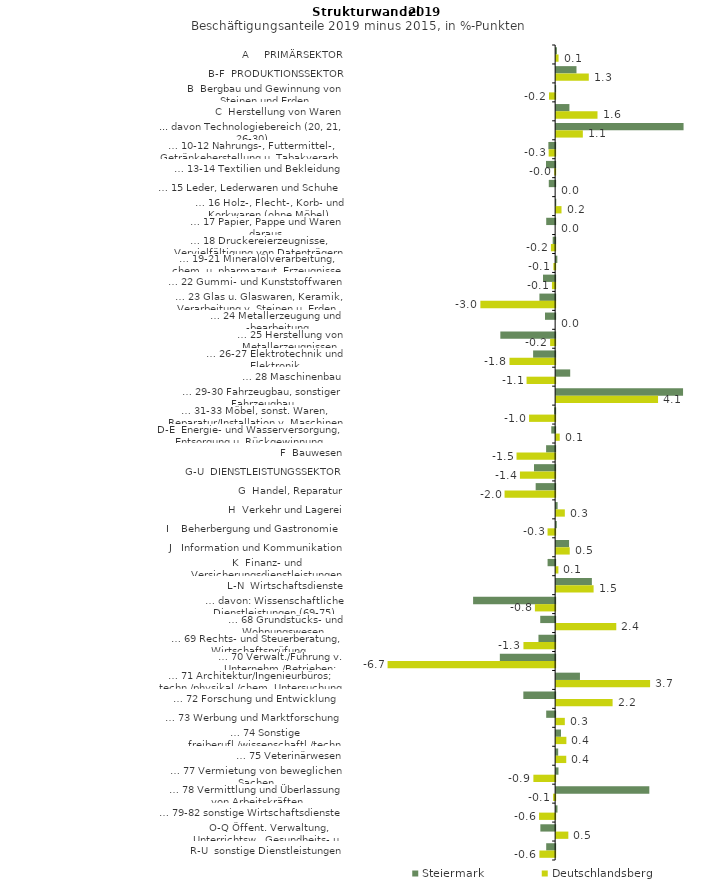
| Category | Steiermark | Deutschlandsberg |
|---|---|---|
| A     PRIMÄRSEKTOR | 0.031 | 0.096 |
| B-F  PRODUKTIONSSEKTOR | 0.809 | 1.299 |
| B  Bergbau und Gewinnung von Steinen und Erden | -0.014 | -0.243 |
| C  Herstellung von Waren | 0.528 | 1.645 |
| ... davon Technologiebereich (20, 21, 26-30) | 5.068 | 1.062 |
| … 10-12 Nahrungs-, Futtermittel-, Getränkeherstellung u. Tabakverarb. | -0.269 | -0.258 |
| … 13-14 Textilien und Bekleidung | -0.363 | -0.035 |
| … 15 Leder, Lederwaren und Schuhe | -0.253 | 0 |
| … 16 Holz-, Flecht-, Korb- und Korkwaren (ohne Möbel)  | 0.005 | 0.213 |
| … 17 Papier, Pappe und Waren daraus  | -0.355 | 0 |
| … 18 Druckereierzeugnisse, Vervielfältigung von Datenträgern | -0.098 | -0.168 |
| … 19-21 Mineralölverarbeitung, chem. u. pharmazeut. Erzeugnisse | 0.048 | -0.071 |
| … 22 Gummi- und Kunststoffwaren | -0.484 | -0.127 |
| … 23 Glas u. Glaswaren, Keramik, Verarbeitung v. Steinen u. Erden  | -0.625 | -2.973 |
| … 24 Metallerzeugung und -bearbeitung | -0.403 | 0 |
| … 25 Herstellung von Metallerzeugnissen  | -2.18 | -0.199 |
| … 26-27 Elektrotechnik und Elektronik | -0.876 | -1.816 |
| … 28 Maschinenbau | 0.559 | -1.137 |
| … 29-30 Fahrzeugbau, sonstiger Fahrzeugbau | 5.047 | 4.053 |
| … 31-33 Möbel, sonst. Waren, Reparatur/Installation v. Maschinen | -0.041 | -1.038 |
| D-E  Energie- und Wasserversorgung, Entsorgung u. Rückgewinnung | -0.153 | 0.143 |
| F  Bauwesen | -0.36 | -1.536 |
| G-U  DIENSTLEISTUNGSSEKTOR | -0.84 | -1.4 |
| G  Handel, Reparatur | -0.775 | -2.012 |
| H  Verkehr und Lagerei | 0.059 | 0.346 |
| I    Beherbergung und Gastronomie | 0.026 | -0.302 |
| J   Information und Kommunikation | 0.514 | 0.541 |
| K  Finanz- und Versicherungsdienstleistungen | -0.301 | 0.089 |
| L-N  Wirtschaftsdienste | 1.421 | 1.49 |
| … davon: Wissenschaftliche Dienstleistungen (69-75) | -3.263 | -0.805 |
| … 68 Grundstücks- und Wohnungswesen  | -0.593 | 2.392 |
| … 69 Rechts- und Steuerberatung, Wirtschaftsprüfung | -0.663 | -1.261 |
| … 70 Verwalt./Führung v. Unternehm./Betrieben; Unternehmensberat. | -2.199 | -6.665 |
| … 71 Architektur/Ingenieurbüros; techn./physikal./chem. Untersuchung | 0.947 | 3.736 |
| … 72 Forschung und Entwicklung  | -1.265 | 2.245 |
| … 73 Werbung und Marktforschung | -0.356 | 0.345 |
| … 74 Sonstige freiberufl./wissenschaftl./techn. Tätigkeiten | 0.194 | 0.407 |
| … 75 Veterinärwesen | 0.081 | 0.402 |
| … 77 Vermietung von beweglichen Sachen  | 0.093 | -0.865 |
| … 78 Vermittlung und Überlassung von Arbeitskräften | 3.706 | -0.081 |
| … 79-82 sonstige Wirtschaftsdienste | 0.053 | -0.641 |
| O-Q Öffent. Verwaltung, Unterrichtsw., Gesundheits- u. Sozialwesen | -0.588 | 0.485 |
| R-U  sonstige Dienstleistungen | -0.356 | -0.626 |